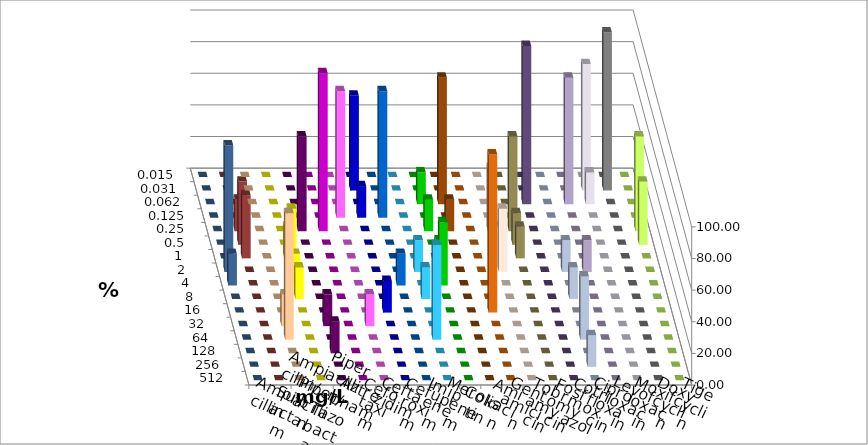
| Category | Ampicillin | Ampicillin/ Sulbactam | Piperacillin | Piperacillin/ Tazobactam | Aztreonam | Cefotaxim | Ceftazidim | Cefuroxim | Imipenem | Meropenem | Colistin | Amikacin | Gentamicin | Tobramycin | Fosfomycin | Cotrimoxazol | Ciprofloxacin | Levofloxacin | Moxifloxacin | Doxycyclin | Tigecyclin |
|---|---|---|---|---|---|---|---|---|---|---|---|---|---|---|---|---|---|---|---|---|---|
| 0.015 | 0 | 0 | 0 | 0 | 0 | 0 | 0 | 0 | 0 | 0 | 0 | 0 | 0 | 0 | 0 | 0 | 0 | 0 | 0 | 0 | 0 |
| 0.031 | 0 | 0 | 0 | 0 | 0 | 60 | 0 | 0 | 0 | 0 | 0 | 0 | 0 | 0 | 0 | 0 | 80 | 100 | 0 | 0 | 0 |
| 0.062 | 0 | 0 | 0 | 0 | 0 | 0 | 0 | 0 | 20 | 80 | 0 | 0 | 0 | 100 | 0 | 80 | 20 | 0 | 0 | 0 | 0 |
| 0.125 | 0 | 0 | 0 | 0 | 80 | 20 | 80 | 0 | 0 | 0 | 0 | 0 | 0 | 0 | 0 | 0 | 0 | 0 | 0 | 0 | 0 |
| 0.25 | 0 | 0 | 60 | 100 | 0 | 0 | 0 | 0 | 20 | 20 | 0 | 40 | 60 | 0 | 0 | 0 | 0 | 0 | 60 | 0 | 20 |
| 0.5 | 0 | 0 | 0 | 0 | 0 | 0 | 0 | 0 | 0 | 0 | 0 | 0 | 20 | 0 | 0 | 0 | 0 | 0 | 40 | 0 | 40 |
| 1.0 | 0 | 20 | 0 | 0 | 0 | 0 | 0 | 0 | 0 | 0 | 0 | 20 | 20 | 0 | 0 | 0 | 0 | 0 | 0 | 0 | 40 |
| 2.0 | 0 | 40 | 0 | 0 | 0 | 0 | 0 | 20 | 20 | 0 | 0 | 40 | 0 | 0 | 20 | 20 | 0 | 0 | 0 | 80 | 0 |
| 4.0 | 0 | 20 | 0 | 0 | 0 | 0 | 20 | 0 | 40 | 0 | 0 | 0 | 0 | 0 | 0 | 0 | 0 | 0 | 0 | 20 | 0 |
| 8.0 | 0 | 20 | 0 | 0 | 0 | 0 | 0 | 20 | 0 | 0 | 0 | 0 | 0 | 0 | 20 | 0 | 0 | 0 | 0 | 0 | 0 |
| 16.0 | 0 | 0 | 0 | 0 | 0 | 20 | 0 | 0 | 0 | 0 | 100 | 0 | 0 | 0 | 0 | 0 | 0 | 0 | 0 | 0 | 0 |
| 32.0 | 20 | 0 | 20 | 0 | 20 | 0 | 0 | 0 | 0 | 0 | 0 | 0 | 0 | 0 | 0 | 0 | 0 | 0 | 0 | 0 | 0 |
| 64.0 | 80 | 0 | 0 | 0 | 0 | 0 | 0 | 60 | 0 | 0 | 0 | 0 | 0 | 0 | 40 | 0 | 0 | 0 | 0 | 0 | 0 |
| 128.0 | 0 | 0 | 20 | 0 | 0 | 0 | 0 | 0 | 0 | 0 | 0 | 0 | 0 | 0 | 0 | 0 | 0 | 0 | 0 | 0 | 0 |
| 256.0 | 0 | 0 | 0 | 0 | 0 | 0 | 0 | 0 | 0 | 0 | 0 | 0 | 0 | 0 | 20 | 0 | 0 | 0 | 0 | 0 | 0 |
| 512.0 | 0 | 0 | 0 | 0 | 0 | 0 | 0 | 0 | 0 | 0 | 0 | 0 | 0 | 0 | 0 | 0 | 0 | 0 | 0 | 0 | 0 |